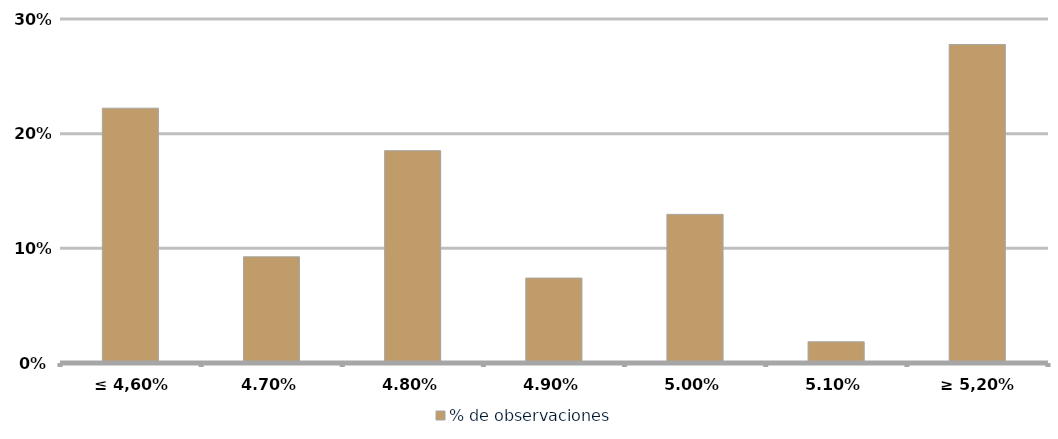
| Category | % de observaciones  |
|---|---|
| ≤ 4,60% | 0.222 |
| 4,70% | 0.093 |
| 4,80% | 0.185 |
| 4,90% | 0.074 |
| 5,00% | 0.13 |
| 5,10% | 0.019 |
| ≥ 5,20% | 0.278 |